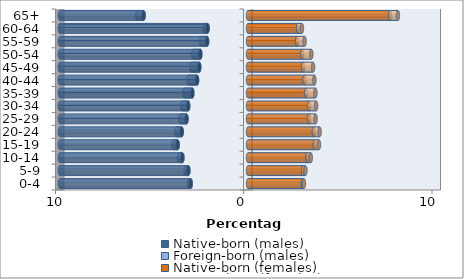
| Category | Native-born (males) | Foreign-born (males) | Native-born (females) | Foreign-born (females) |
|---|---|---|---|---|
| 0-4 | -3.045 | -0.085 | 2.911 | 0.061 |
| 5-9 | -3.168 | -0.146 | 2.934 | 0.119 |
| 10-14 | -3.485 | -0.186 | 3.165 | 0.171 |
| 15-19 | -3.738 | -0.225 | 3.552 | 0.218 |
| 20-24 | -3.522 | -0.296 | 3.499 | 0.304 |
| 25-29 | -3.268 | -0.31 | 3.245 | 0.347 |
| 30-34 | -3.178 | -0.311 | 3.247 | 0.371 |
| 35-39 | -2.958 | -0.42 | 3.089 | 0.492 |
| 40-44 | -2.705 | -0.45 | 3.003 | 0.525 |
| 45-49 | -2.588 | -0.423 | 2.935 | 0.521 |
| 50-54 | -2.533 | -0.374 | 2.883 | 0.48 |
| 55-59 | -2.173 | -0.314 | 2.611 | 0.396 |
| 60-64 | -2.147 | -0.164 | 2.66 | 0.205 |
| 65+ | -5.547 | -0.332 | 7.551 | 0.414 |